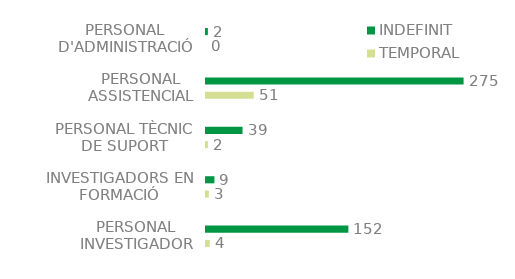
| Category | TEMPORAL | INDEFINIT |
|---|---|---|
| PERSONAL INVESTIGADOR | 4 | 152 |
| INVESTIGADORS EN FORMACIÓ | 3 | 9 |
| PERSONAL TÈCNIC DE SUPORT | 2 | 39 |
| PERSONAL ASSISTENCIAL | 51 | 275 |
| PERSONAL D'ADMINISTRACIÓ | 0 | 2 |